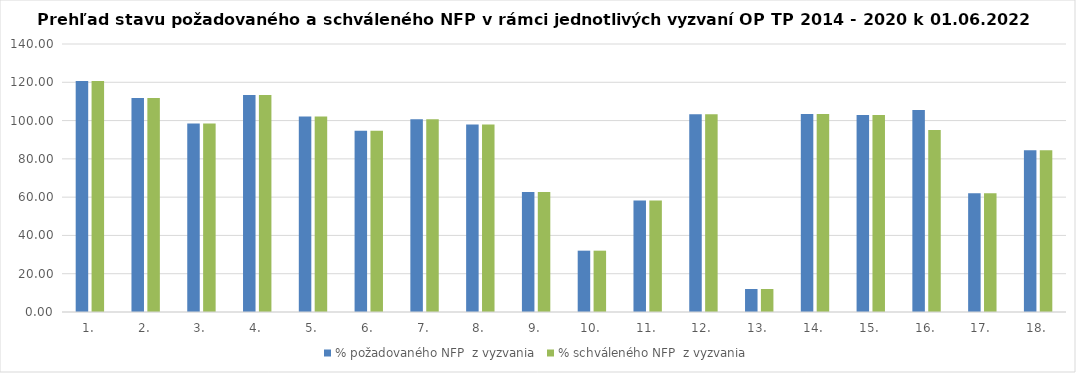
| Category | % požadovaného NFP  z vyzvania | % schváleného NFP  z vyzvania |
|---|---|---|
| 1. | 120.662 | 120.662 |
| 2. | 111.83 | 111.83 |
| 3. | 98.465 | 98.465 |
| 4. | 113.295 | 113.295 |
| 5. | 102.19 | 102.19 |
| 6. | 94.643 | 94.643 |
| 7. | 100.637 | 100.637 |
| 8. | 97.989 | 97.989 |
| 9. | 62.721 | 62.721 |
| 10. | 32.038 | 32.038 |
| 11. | 58.283 | 58.283 |
| 12. | 103.242 | 103.242 |
| 13. | 12.008 | 12.008 |
| 14. | 103.392 | 103.392 |
| 15. | 102.872 | 102.872 |
| 16. | 105.492 | 95.126 |
| 17. | 61.969 | 61.969 |
| 18. | 84.514 | 84.514 |